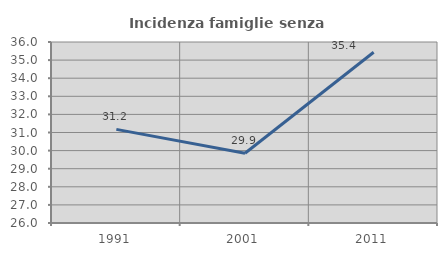
| Category | Incidenza famiglie senza nuclei |
|---|---|
| 1991.0 | 31.173 |
| 2001.0 | 29.856 |
| 2011.0 | 35.437 |